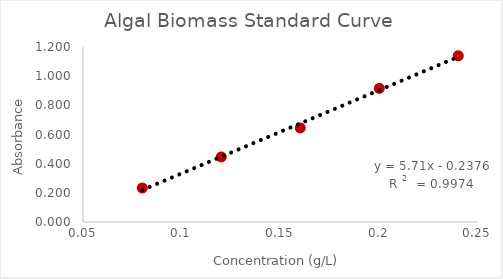
| Category | Series 0 |
|---|---|
| 0.24 | 1.14 |
| 0.2 | 0.916 |
| 0.16 | 0.645 |
| 0.12 | 0.446 |
| 0.08 | 0.233 |